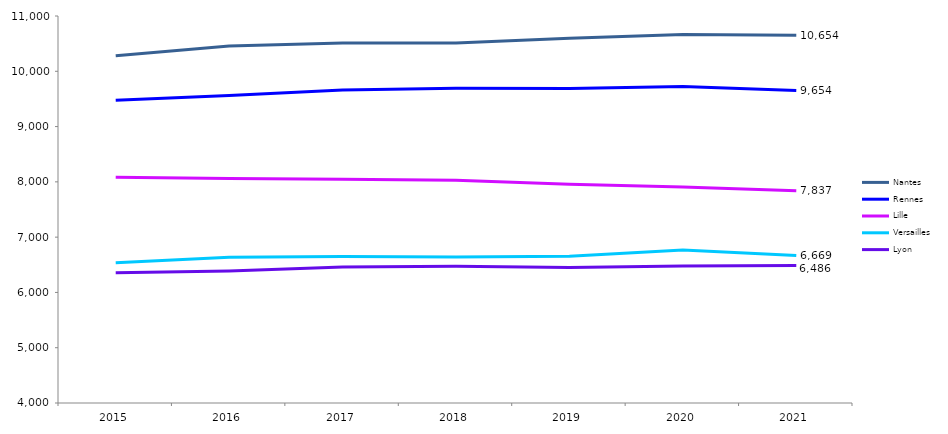
| Category | Nantes | Rennes | Lille | Versailles | Lyon |
|---|---|---|---|---|---|
| 2015.0 | 10283 | 9478 | 8083 | 6536 | 6355 |
| 2016.0 | 10456 | 9564 | 8060 | 6638 | 6388 |
| 2017.0 | 10511 | 9662 | 8048 | 6651 | 6460 |
| 2018.0 | 10510 | 9691 | 8028 | 6642 | 6474 |
| 2019.0 | 10598 | 9689 | 7956 | 6655 | 6453 |
| 2020.0 | 10665 | 9726 | 7908 | 6769 | 6480 |
| 2021.0 | 10654 | 9654 | 7837 | 6669 | 6486 |